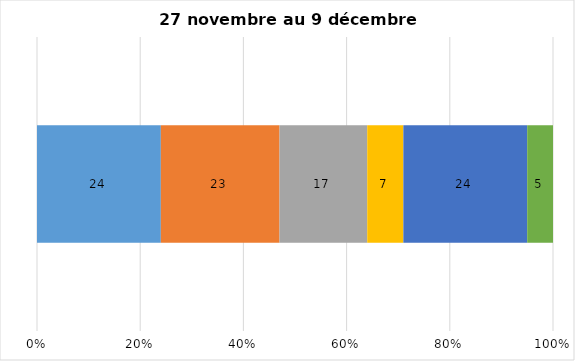
| Category | Plusieurs fois par jour | Une fois par jour | Quelques fois par semaine   | Une fois par semaine ou moins   |  Jamais   |  Je n’utilise pas les médias sociaux |
|---|---|---|---|---|---|---|
| 0 | 24 | 23 | 17 | 7 | 24 | 5 |